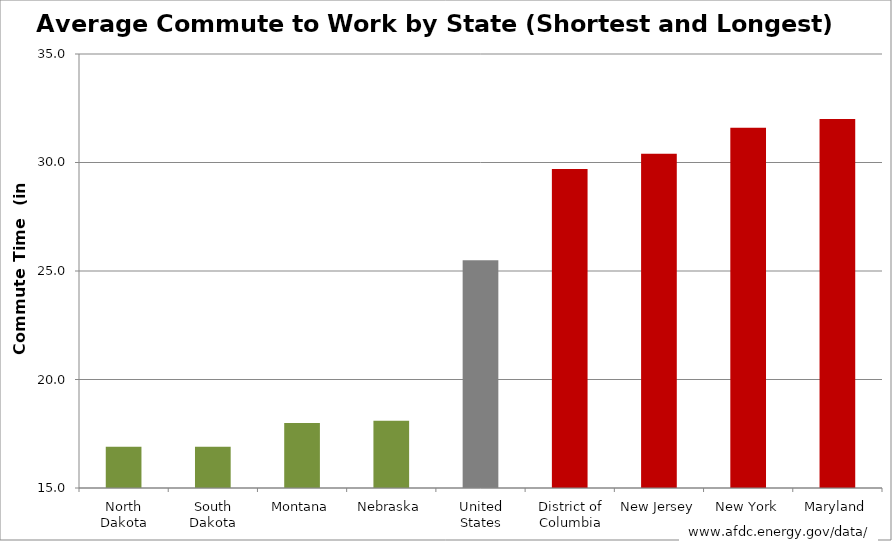
| Category | Average Commute (minutes) |
|---|---|
| North Dakota | 16.9 |
| South Dakota | 16.9 |
| Montana | 18 |
| Nebraska | 18.1 |
| United States | 25.5 |
| District of Columbia | 29.7 |
| New Jersey | 30.4 |
| New York | 31.6 |
| Maryland | 32 |